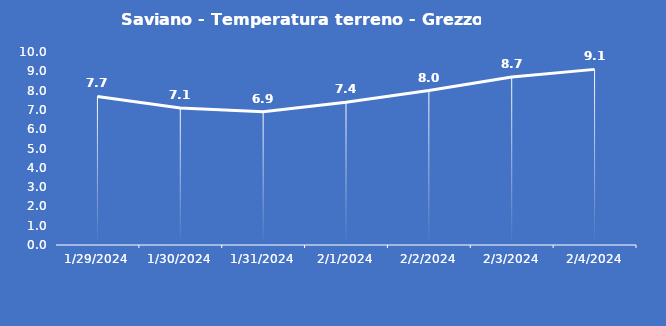
| Category | Saviano - Temperatura terreno - Grezzo (°C) |
|---|---|
| 1/29/24 | 7.7 |
| 1/30/24 | 7.1 |
| 1/31/24 | 6.9 |
| 2/1/24 | 7.4 |
| 2/2/24 | 8 |
| 2/3/24 | 8.7 |
| 2/4/24 | 9.1 |